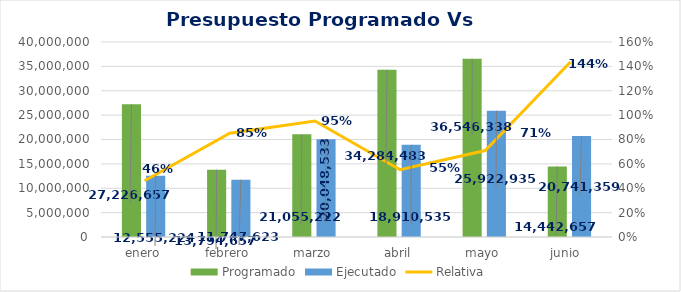
| Category | Programado | Ejecutado |
|---|---|---|
| enero | 27226656.67 | 12555224.24 |
| febrero | 13794656.67 | 11747622.83 |
| marzo | 21055222 | 20048533.17 |
| abril | 34284483 | 18910535.17 |
| mayo | 36546338 | 25922935.07 |
| junio  | 14442657 | 20741358.7 |